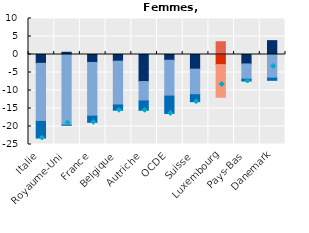
| Category | Heures par salarié en emploi | Emploi sans heures travaillées | Chômage (net de l'évolution démographique) |
|---|---|---|---|
| Italie | -2.457 | -16.128 | -4.63 |
| Royaume-Uni | 0.625 | -19.616 | -0.033 |
| France | -2.211 | -14.922 | -1.717 |
| Belgique | -1.856 | -12.161 | -1.458 |
| Autriche | -7.518 | -5.38 | -2.593 |
| OCDE | -1.6 | -9.952 | -4.825 |
| Suisse | -4.071 | -7.097 | -1.936 |
| Luxembourg | -2.815 | -9.07 | 3.545 |
| Pays-Bas | -2.628 | -4.234 | -0.517 |
| Danemark | 3.849 | -6.57 | -0.601 |